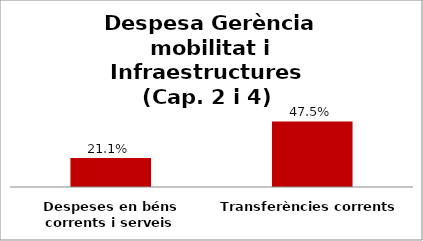
| Category | Series 0 |
|---|---|
| Despeses en béns corrents i serveis | 0.211 |
| Transferències corrents | 0.475 |